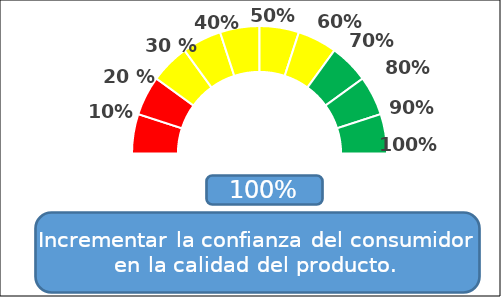
| Category | Series 0 |
|---|---|
| 0 | 1 |
| 1 | 1 |
| 2 | 1 |
| 3 | 1 |
| 4 | 1 |
| 5 | 1 |
| 6 | 1 |
| 7 | 1 |
| 8 | 1 |
| 9 | 1 |
| 10 | 10 |